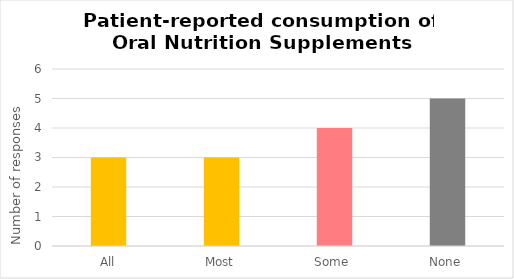
| Category | Series 0 |
|---|---|
| All | 3 |
| Most | 3 |
| Some  | 4 |
| None | 5 |